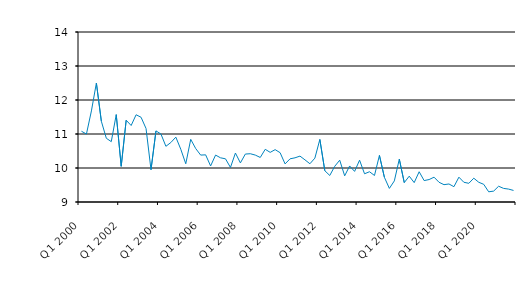
| Category | Series 0 |
|---|---|
| Q1 2000 | 11.08 |
| Q2 2000 | 11 |
| Q3 2000 | 11.679 |
| Q4 2000 | 12.5 |
| Q1 2001 | 11.375 |
| Q2 2001 | 10.875 |
| Q3 2001 | 10.775 |
| Q4 2001 | 11.57 |
| Q1 2002 | 10.05 |
| Q2 2002 | 11.405 |
| Q3 2002 | 11.25 |
| Q4 2002 | 11.566 |
| Q1 2003 | 11.492 |
| Q2 2003 | 11.162 |
| Q3 2003 | 9.95 |
| Q4 2003 | 11.091 |
| Q1 2004 | 11 |
| Q2 2004 | 10.638 |
| Q3 2004 | 10.75 |
| Q4 2004 | 10.908 |
| Q1 2005 | 10.55 |
| Q2 2005 | 10.125 |
| Q3 2005 | 10.843 |
| Q4 2005 | 10.573 |
| Q1 2006 | 10.38 |
| Q2 2006 | 10.387 |
| Q3 2006 | 10.06 |
| Q4 2006 | 10.38 |
| Q1 2007 | 10.3 |
| Q2 2007 | 10.27 |
| Q3 2007 | 10.017 |
| Q4 2007 | 10.44 |
| Q1 2008 | 10.15 |
| Q2 2008 | 10.41 |
| Q3 2008 | 10.42 |
| Q4 2008 | 10.38 |
| Q1 2009 | 10.31 |
| Q2 2009 | 10.55 |
| Q3 2009 | 10.46 |
| Q4 2009 | 10.54 |
| Q1 2010 | 10.45 |
| Q2 2010 | 10.12 |
| Q3 2010 | 10.27 |
| Q4 2010 | 10.3 |
| Q1 2011 | 10.35 |
| Q2 2011 | 10.24 |
| Q3 2011 | 10.125 |
| Q4 2011 | 10.29 |
| Q1 2012 | 10.84 |
| Q2 2012 | 9.92 |
| Q3 2012 | 9.78 |
| Q4 2012 | 10.05 |
| Q1 2013 | 10.23 |
| Q2 2013 | 9.77 |
| Q3 2013 | 10.06 |
| Q4 2013 | 9.9 |
| Q1 2014 | 10.23 |
| Q2 2014 | 9.83 |
| Q3 2014 | 9.89 |
| Q4 2014 | 9.78 |
| Q1 2015 | 10.37 |
| Q2 2015 | 9.726 |
| Q3 2015 | 9.4 |
| Q4 2015 | 9.62 |
| Q1 2016 | 10.26 |
| Q2 2016 | 9.57 |
| Q3 2016 | 9.76 |
| Q4 2016 | 9.57 |
| Q1 2017 | 9.89 |
| Q2 2017 | 9.63 |
| Q3 2017 | 9.66 |
| Q4 2017 | 9.73 |
| Q1 2018 | 9.58 |
| Q2 2018 | 9.51 |
| Q3 2018 | 9.53 |
| Q4 2018 | 9.45 |
| Q1 2019 | 9.73 |
| Q2 2019 | 9.58 |
| Q3 2019 | 9.55 |
| Q4 2019 | 9.7 |
| Q1 2020 | 9.58 |
| Q2 2020 | 9.52 |
| Q3 2020 | 9.3 |
| Q4 2020 | 9.32 |
| Q1 2021 | 9.464 |
| Q2 2021 | 9.4 |
| Q3 2021 | 9.38 |
| Q4 2021 | 9.34 |